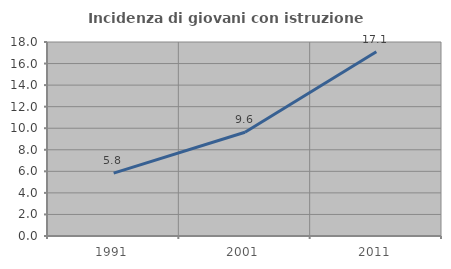
| Category | Incidenza di giovani con istruzione universitaria |
|---|---|
| 1991.0 | 5.839 |
| 2001.0 | 9.626 |
| 2011.0 | 17.089 |